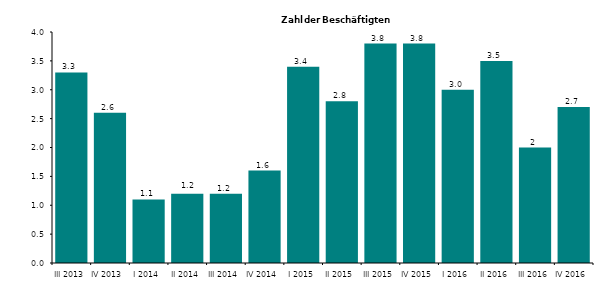
| Category | 3,3 2,6 1,1 1,2 1,2 1,6 3,4 2,8 3,8 3,8 3,0 3,5 2 2,7 |
|---|---|
| III 2013 | 3.3 |
| IV 2013 | 2.6 |
| I 2014 | 1.1 |
| II 2014 | 1.2 |
| III 2014 | 1.2 |
| IV 2014 | 1.6 |
| I 2015 | 3.4 |
| II 2015 | 2.8 |
| III 2015 | 3.8 |
| IV 2015 | 3.8 |
| I 2016 | 3 |
| II 2016 | 3.5 |
| III 2016 | 2 |
| IV 2016 | 2.7 |